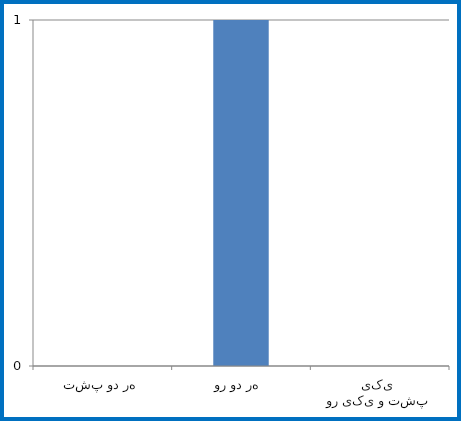
| Category | Series 0 |
|---|---|
| هر دو پشت | 0 |
| هر دو رو  | 1 |
| یکی پشت و یکی رو  | 0 |